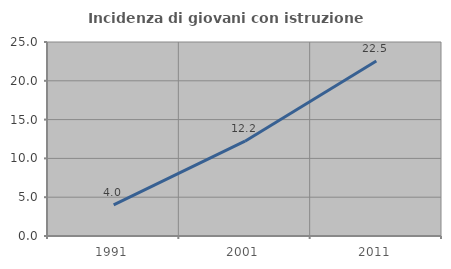
| Category | Incidenza di giovani con istruzione universitaria |
|---|---|
| 1991.0 | 4 |
| 2001.0 | 12.222 |
| 2011.0 | 22.549 |